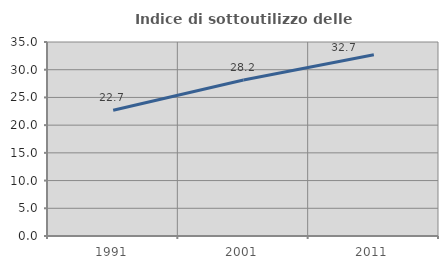
| Category | Indice di sottoutilizzo delle abitazioni  |
|---|---|
| 1991.0 | 22.672 |
| 2001.0 | 28.156 |
| 2011.0 | 32.702 |